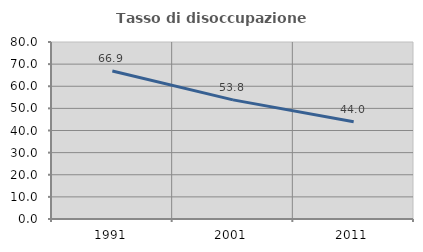
| Category | Tasso di disoccupazione giovanile  |
|---|---|
| 1991.0 | 66.882 |
| 2001.0 | 53.846 |
| 2011.0 | 43.988 |